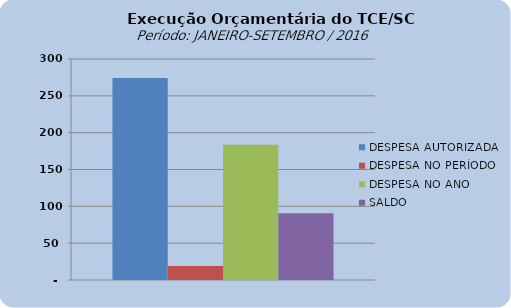
| Category | DESPESA AUTORIZADA | DESPESA NO PERÍODO | DESPESA NO ANO | SALDO |
|---|---|---|---|---|
| 0 | 274241687.61 | 18920821.04 | 183584363.03 | 90657324.58 |